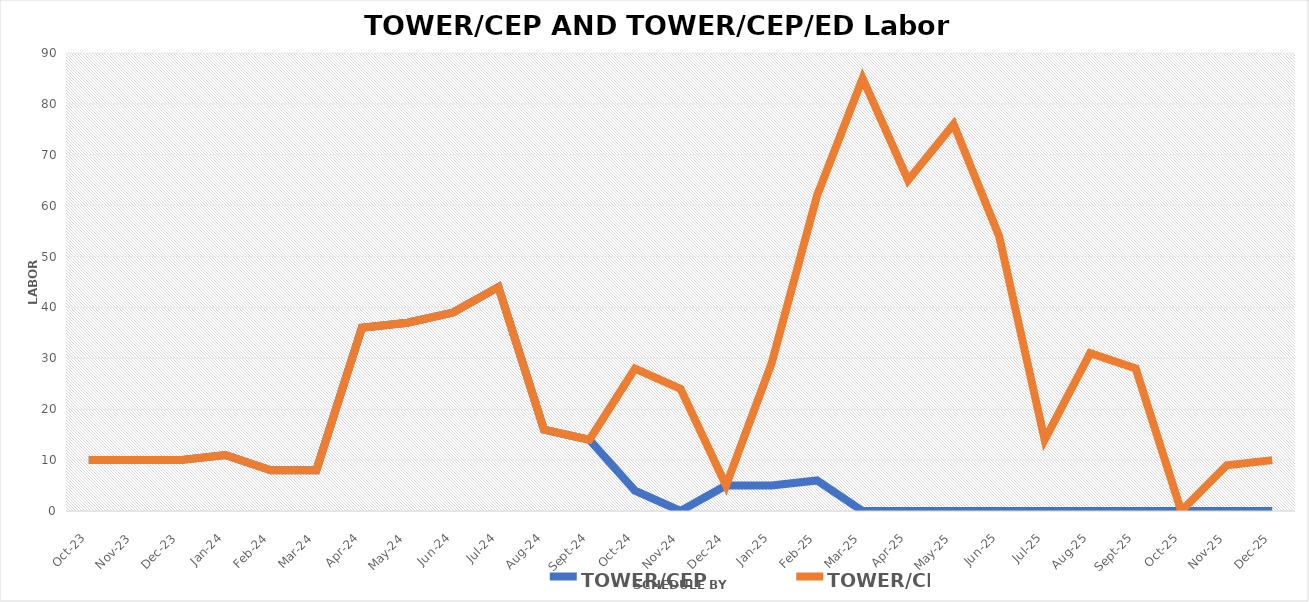
| Category | TOWER/CEP | TOWER/CEP/ED |
|---|---|---|
| 2023-10-01 | 10 | 10 |
| 2023-11-01 | 10 | 10 |
| 2023-12-01 | 10 | 10 |
| 2024-01-01 | 11 | 11 |
| 2024-02-01 | 8 | 8 |
| 2024-03-01 | 8 | 8 |
| 2024-04-01 | 36 | 36 |
| 2024-05-01 | 37 | 37 |
| 2024-06-01 | 39 | 39 |
| 2024-07-01 | 44 | 44 |
| 2024-08-01 | 16 | 16 |
| 2024-09-01 | 14 | 14 |
| 2024-10-01 | 4 | 28 |
| 2024-11-01 | 0 | 24 |
| 2024-12-01 | 5 | 5 |
| 2025-01-01 | 5 | 29 |
| 2025-02-01 | 6 | 62 |
| 2025-03-01 | 0 | 85 |
| 2025-04-01 | 0 | 65 |
| 2025-05-01 | 0 | 76 |
| 2025-06-01 | 0 | 54 |
| 2025-07-01 | 0 | 14 |
| 2025-08-01 | 0 | 31 |
| 2025-09-01 | 0 | 28 |
| 2025-10-01 | 0 | 0 |
| 2025-11-01 | 0 | 9 |
| 2025-12-01 | 0 | 10 |